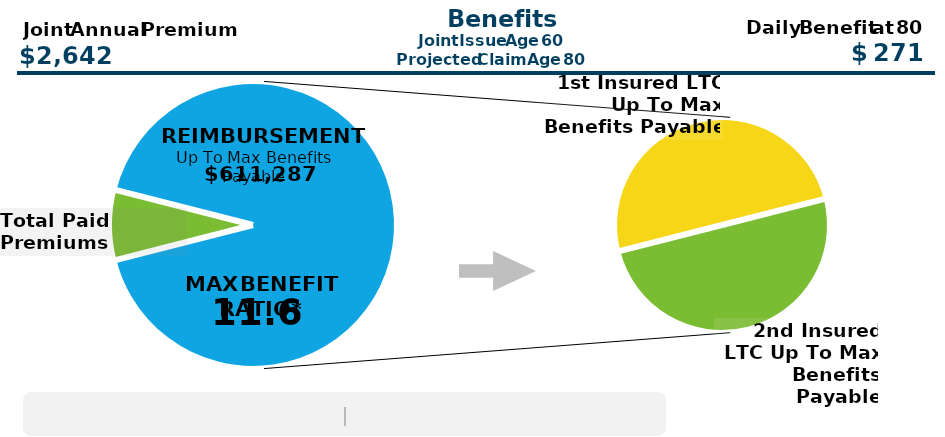
| Category | Series 0 |
|---|---|
| Total Paid Premiums | 52840.2 |
| 1st Insured LTC Up To Max Benefits Payable | 305643.7 |
| 2nd Insured LTC Up To Max Benefits Payable | 305643.7 |